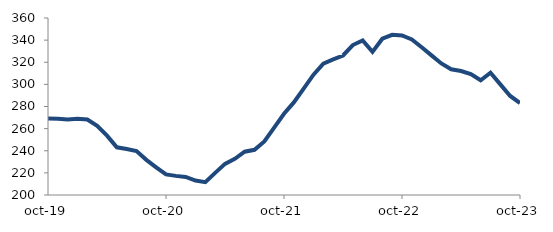
| Category | Series 0 |
|---|---|
| 2019-10-01 | 269.246 |
| 2019-11-01 | 268.873 |
| 2019-12-01 | 268.319 |
| 2020-01-01 | 268.914 |
| 2020-02-01 | 268.233 |
| 2020-03-01 | 262.58 |
| 2020-04-01 | 253.663 |
| 2020-05-01 | 243.088 |
| 2020-06-01 | 241.541 |
| 2020-07-01 | 239.786 |
| 2020-08-01 | 231.766 |
| 2020-09-01 | 225.047 |
| 2020-10-01 | 218.571 |
| 2020-11-01 | 217.286 |
| 2020-12-01 | 216.368 |
| 2021-01-01 | 213.087 |
| 2021-02-01 | 211.643 |
| 2021-03-01 | 220.04 |
| 2021-04-01 | 228.12 |
| 2021-05-01 | 232.717 |
| 2021-06-01 | 239.097 |
| 2021-07-01 | 240.846 |
| 2021-08-01 | 248.449 |
| 2021-09-01 | 260.934 |
| 2021-10-01 | 273.441 |
| 2021-11-01 | 283.683 |
| 2021-12-01 | 296.134 |
| 2022-01-01 | 308.804 |
| 2022-02-01 | 318.726 |
| 2022-03-01 | 322.592 |
| 2022-04-01 | 326.114 |
| 2022-05-01 | 335.557 |
| 2022-06-01 | 339.684 |
| 2022-07-01 | 329.357 |
| 2022-08-01 | 341.293 |
| 2022-09-01 | 344.793 |
| 2022-10-01 | 344.185 |
| 2022-11-01 | 340.608 |
| 2022-12-01 | 333.559 |
| 2023-01-01 | 326.199 |
| 2023-02-01 | 318.915 |
| 2023-03-01 | 313.615 |
| 2023-04-01 | 312.076 |
| 2023-05-01 | 309.232 |
| 2023-06-01 | 303.714 |
| 2023-07-01 | 310.493 |
| 2023-08-01 | 299.987 |
| 2023-09-01 | 289.543 |
| 2023-10-01 | 283.093 |